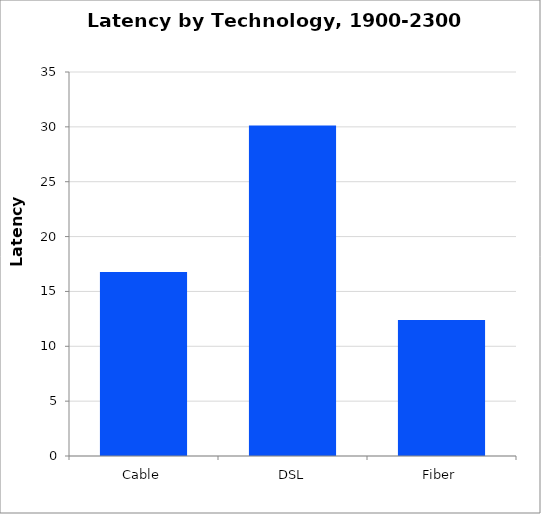
| Category | Series 0 |
|---|---|
| Cable | 16.773 |
| DSL | 30.12 |
| Fiber | 12.391 |